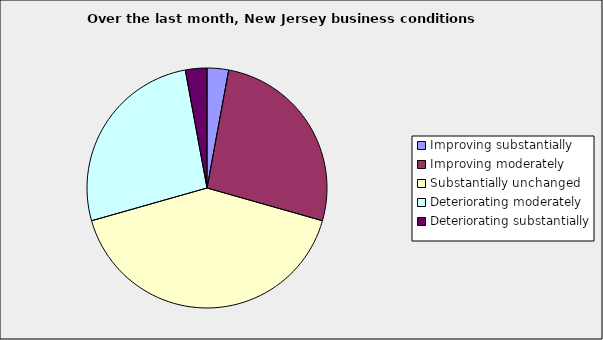
| Category | Series 0 |
|---|---|
| Improving substantially | 0.029 |
| Improving moderately | 0.265 |
| Substantially unchanged | 0.412 |
| Deteriorating moderately | 0.265 |
| Deteriorating substantially | 0.029 |